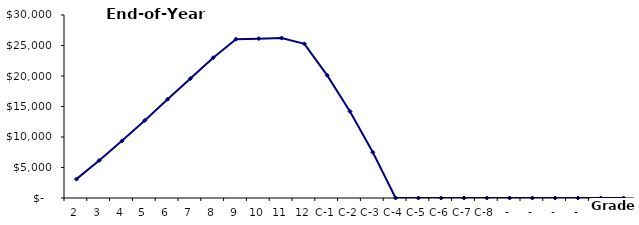
| Category | End of Year Balance |
|---|---|
| 2 | 3093.041 |
| 3 | 6163.627 |
| 4 | 9367.286 |
| 5 | 12709.783 |
| 6 | 16197.137 |
| 7 | 19574.79 |
| 8 | 22994.489 |
| 9 | 26040.722 |
| 10 | 26125.929 |
| 11 | 26214.83 |
| 12 | 25264.245 |
| C-1 | 20099.114 |
| C-2 | 14188.468 |
| C-3 | 7500 |
| C-4 | 0 |
| C-5 | 0 |
| C-6 | 0 |
| C-7 | 0 |
| C-8 | 0 |
|  -  | 0 |
|  -  | 0 |
|  -  | 0 |
|  -  | 0 |
|  -  | 0 |
|  -  | 0 |